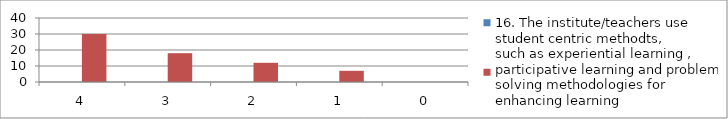
| Category | 16. The institute/teachers use student centric methodts,
such as experiential learning , participative learning and problem solving methodologies for enhancing learning | Series 1 |
|---|---|---|
| 4.0 | 0 | 30 |
| 3.0 | 0 | 18 |
| 2.0 | 0 | 12 |
| 1.0 | 0 | 7 |
| 0.0 | 0 | 0 |